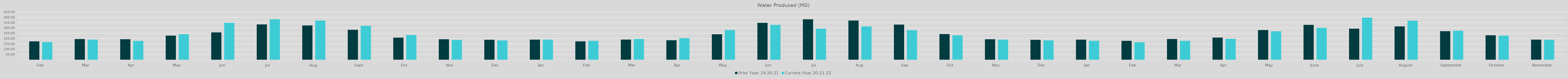
| Category | Prior Year 19-20-21 | Current Year 20-21-22 |
|---|---|---|
| Feb | 173.847 | 167.532 |
| Mar | 195.333 | 190.306 |
| Apr | 193.551 | 178.22 |
| May | 228.091 | 240.625 |
| Jun | 257.9 | 348.57 |
| Jul | 333.37 | 381.34 |
| Aug | 323.49 | 370.12 |
| Sep | 282.53 | 320.39 |
| Oct | 208.72 | 233.34 |
| Nov | 193.92 | 187.14 |
| Dec | 188.86 | 182.02 |
| Jan | 189.94 | 189.96 |
| Feb | 173.75 | 178.97 |
| Mar | 190.77 | 195.96 |
| Apr | 184.23 | 203.05 |
| May | 240.63 | 280.19 |
| Jun | 348.57 | 329.038 |
| Jul | 381.336 | 293.585 |
| Aug | 370.12 | 314.51 |
| Sep | 331.274 | 279.105 |
| Oct | 242.62 | 230.88 |
| Nov | 193.57 | 189.82 |
| Dec | 188.584 | 182.826 |
| Jan | 189.967 | 179.43 |
| Feb | 178.97 | 165.72 |
| Mar | 195.963 | 178.569 |
| Apr | 209.272 | 197.981 |
| May | 280.192 | 268.985 |
| June | 329.04 | 300.92 |
| July | 293.59 | 397.41 |
| August | 314.51 | 368.297 |
| September | 269.467 | 273.496 |
| October | 230.879 | 227.64 |
| November | 189.816 | 189.097 |